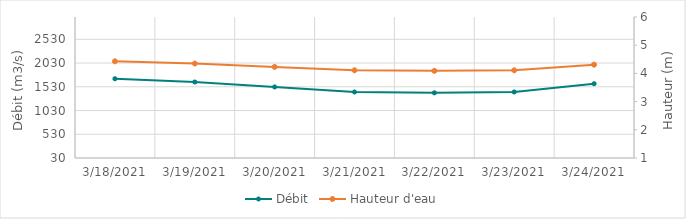
| Category | Débit |
|---|---|
| 2/18/21 | 1414.53 |
| 2/17/21 | 1586.08 |
| 2/16/21 | 1772.68 |
| 2/15/21 | 1925.48 |
| 2/14/21 | 2037.09 |
| 2/13/21 | 2053.99 |
| 2/12/21 | 2045.38 |